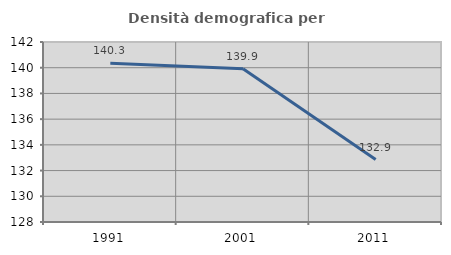
| Category | Densità demografica |
|---|---|
| 1991.0 | 140.343 |
| 2001.0 | 139.913 |
| 2011.0 | 132.856 |